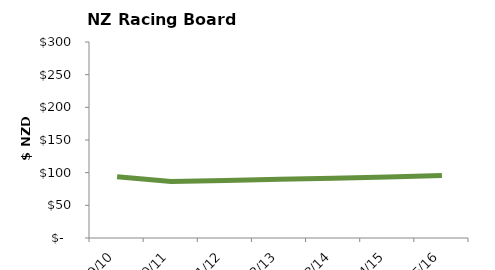
| Category | Inflation adjusted expenditure per capita |
|---|---|
| 2009/10 | 93.791 |
| 2010/11 | 86.458 |
| 2011/12 | 88.152 |
| 2012/13 | 90.096 |
| 2013/14 | 91.632 |
| 2014/15 | 93.403 |
| 2015/16 | 95.5 |